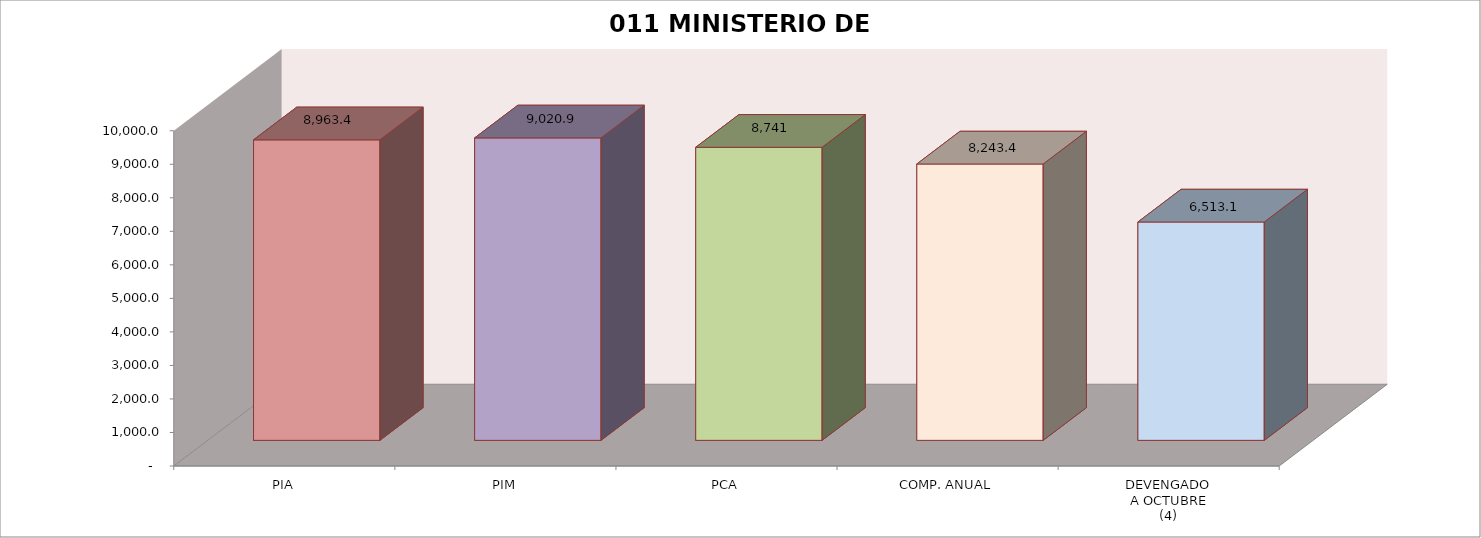
| Category | 011 MINISTERIO DE SALUD |
|---|---|
| PIA | 8963.39 |
| PIM | 9020.857 |
| PCA | 8741.095 |
| COMP. ANUAL | 8243.371 |
| DEVENGADO
A OCTUBRE
(4) | 6513.083 |